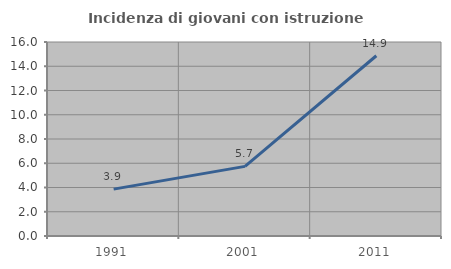
| Category | Incidenza di giovani con istruzione universitaria |
|---|---|
| 1991.0 | 3.865 |
| 2001.0 | 5.743 |
| 2011.0 | 14.865 |